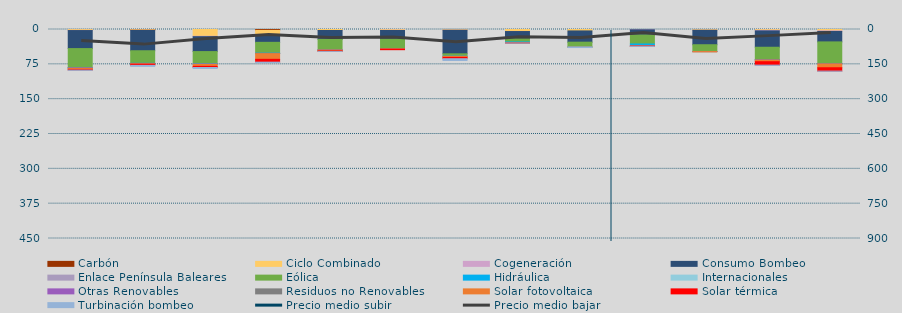
| Category | Carbón | Ciclo Combinado | Cogeneración | Consumo Bombeo | Enlace Península Baleares | Eólica | Hidráulica | Internacionales | Otras Renovables | Residuos no Renovables | Solar fotovoltaica | Solar térmica | Turbinación bombeo |
|---|---|---|---|---|---|---|---|---|---|---|---|---|---|
| 0 | 0 | 1823.5 | 445.3 | 38830 | 0 | 40976.3 | 479.9 | 0 | 886 | 0.2 | 2434.6 | 1489.3 | 549.6 |
| 1 | 543 | 1288.6 | 238.655 | 43678.268 | 0 | 27098.515 | 150.455 | 0 | 982.208 | 13.2 | 761.432 | 2474.8 | 2164.5 |
| 2 | 0 | 14634.199 | 838.098 | 32075.867 | 0 | 26340.743 | 533.073 | 0 | 507.085 | 0 | 4421.722 | 2509.099 | 1924.625 |
| 3 | 1932.082 | 9683.392 | 448.406 | 15579.715 | 0 | 23351.965 | 345.088 | 0 | 633.184 | 108.783 | 12157.29 | 6064.342 | 913.05 |
| 4 | 0 | 2088.417 | 56.138 | 18984.933 | 0 | 23010.334 | 40.779 | 0 | 39.002 | 82.474 | 1741.959 | 1100.186 | 17.7 |
| 5 | 20 | 1489.042 | 599.786 | 18456.273 | 0 | 20881.86 | 87.748 | 0 | 304.724 | 12.55 | 573.462 | 1034.589 | 0 |
| 6 | 0 | 1431.5 | 183.958 | 50768.847 | 0 | 5100.208 | 273.474 | 0 | 90.045 | 0 | 2259.405 | 2752.042 | 3910.508 |
| 7 | 0 | 4345.9 | 27.314 | 15616.296 | 0 | 6806.453 | 2149.971 | 0 | 152.334 | 42.654 | 44.067 | 19 | 204.333 |
| 8 | 0 | 3059.067 | 0 | 24243.492 | 0 | 10425.232 | 13.796 | 0 | 0 | 0 | 9.194 | 0 | 1113.3 |
| 9 | 0 | 0 | 655.675 | 11045.084 | 0 | 19430.531 | 3297.137 | 0 | 1221.2 | 4.575 | 380.934 | 279.19 | 100 |
| 10 | 0 | 1578.425 | 97.391 | 31105.358 | 0 | 14760.555 | 0.525 | 0 | 6.9 | 0 | 610.128 | 0 | 0 |
| 11 | 0 | 1682.35 | 1288.318 | 35237.998 | 0 | 26715.501 | 538.936 | 0 | 327.466 | 97.457 | 3459.795 | 7401.339 | 450.583 |
| 12 | 0 | 2896.525 | 1320.794 | 22481.384 | 0 | 46423.207 | 245.293 | 0 | 655.227 | 248.362 | 8080.179 | 7222.305 | 292.5 |